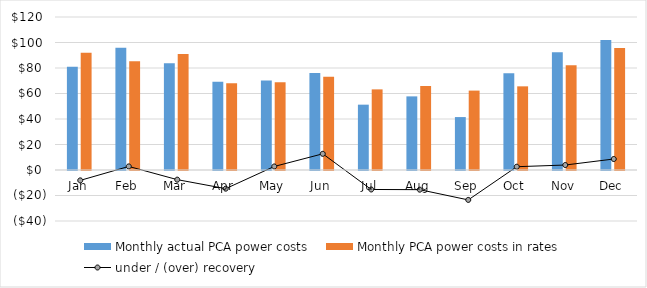
| Category | Monthly actual PCA power costs | Monthly PCA power costs in rates |
|---|---|---|
| Jan | 80.886 | 91.912 |
| Feb | 95.952 | 85.36 |
| Mar | 83.768 | 91.004 |
| Apr | 69.283 | 68.072 |
| May | 70.213 | 68.852 |
| Jun | 75.995 | 73.182 |
| Jul | 51.244 | 63.234 |
| Aug | 57.741 | 65.908 |
| Sep | 41.515 | 62.275 |
| Oct | 75.951 | 65.617 |
| Nov | 92.267 | 82.174 |
| Dec | 101.901 | 95.6 |